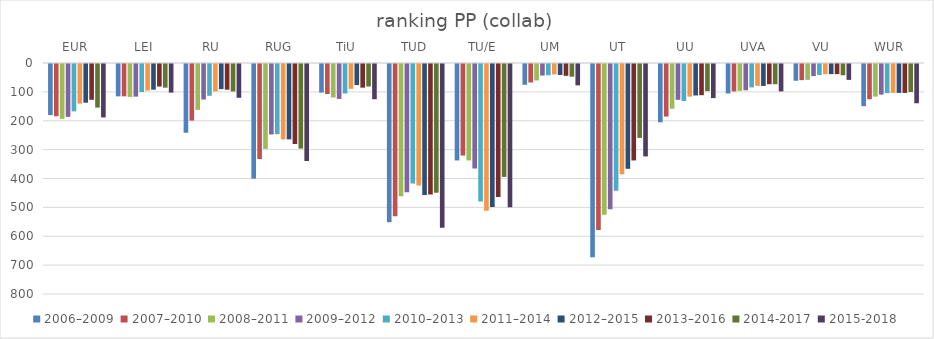
| Category | 2006–2009 | 2007–2010 | 2008–2011 | 2009–2012 | 2010–2013 | 2011–2014 | 2012–2015 | 2013–2016 | 2014-2017 | 2015-2018 |
|---|---|---|---|---|---|---|---|---|---|---|
| EUR | 177 | 181 | 190 | 183 | 164 | 137 | 134 | 124 | 151 | 185 |
| LEI | 112 | 112 | 114 | 113 | 97 | 92 | 89 | 78 | 82 | 99 |
| RU | 238 | 196 | 159 | 123 | 110 | 95 | 87 | 89 | 95 | 117 |
| RUG | 397 | 329 | 294 | 244 | 243 | 261 | 261 | 277 | 293 | 336 |
| TiU | 99 | 104 | 116 | 121 | 102 | 86 | 73 | 82 | 78 | 122 |
| TUD | 548 | 527 | 458 | 444 | 414 | 421 | 454 | 452 | 446 | 567 |
| TU/E | 334 | 317 | 334 | 362 | 476 | 508 | 495 | 461 | 391 | 496 |
| UM | 72 | 64 | 57 | 40 | 39 | 36 | 38 | 41 | 44 | 74 |
| UT | 669 | 575 | 522 | 503 | 439 | 382 | 363 | 334 | 256 | 320 |
| UU | 202 | 182 | 155 | 124 | 128 | 113 | 109 | 108 | 94 | 118 |
| UVA | 102 | 95 | 93 | 91 | 81 | 76 | 76 | 70 | 70 | 95 |
| VU | 58 | 56 | 55 | 42 | 38 | 35 | 35 | 35 | 39 | 55 |
| WUR | 146 | 122 | 113 | 106 | 101 | 100 | 100 | 100 | 97 | 136 |